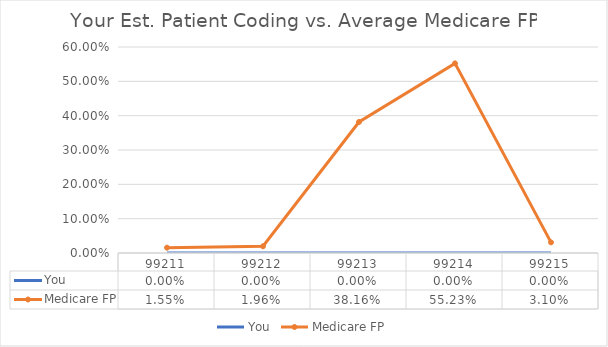
| Category | You | Medicare FP |
|---|---|---|
| 99211.0 | 0 | 0.016 |
| 99212.0 | 0 | 0.02 |
| 99213.0 | 0 | 0.382 |
| 99214.0 | 0 | 0.552 |
| 99215.0 | 0 | 0.031 |